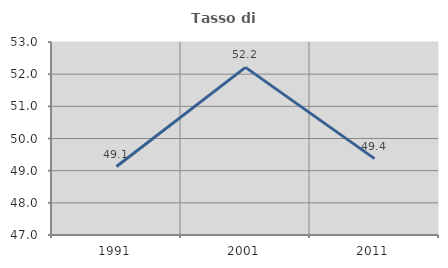
| Category | Tasso di occupazione   |
|---|---|
| 1991.0 | 49.129 |
| 2001.0 | 52.21 |
| 2011.0 | 49.374 |